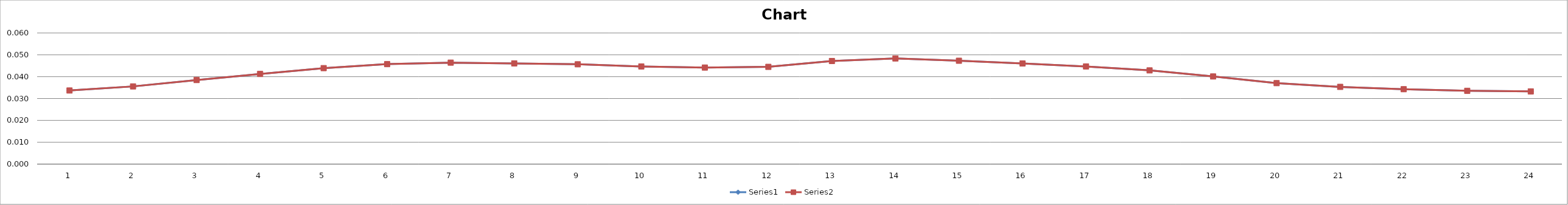
| Category | Series 0 | Series 1 |
|---|---|---|
| 0 | 0.034 | 0.034 |
| 1 | 0.036 | 0.036 |
| 2 | 0.038 | 0.038 |
| 3 | 0.041 | 0.041 |
| 4 | 0.044 | 0.044 |
| 5 | 0.046 | 0.046 |
| 6 | 0.046 | 0.046 |
| 7 | 0.046 | 0.046 |
| 8 | 0.046 | 0.046 |
| 9 | 0.045 | 0.045 |
| 10 | 0.044 | 0.044 |
| 11 | 0.044 | 0.044 |
| 12 | 0.047 | 0.047 |
| 13 | 0.048 | 0.048 |
| 14 | 0.047 | 0.047 |
| 15 | 0.046 | 0.046 |
| 16 | 0.045 | 0.045 |
| 17 | 0.043 | 0.043 |
| 18 | 0.04 | 0.04 |
| 19 | 0.037 | 0.037 |
| 20 | 0.035 | 0.035 |
| 21 | 0.034 | 0.034 |
| 22 | 0.034 | 0.034 |
| 23 | 0.033 | 0.033 |